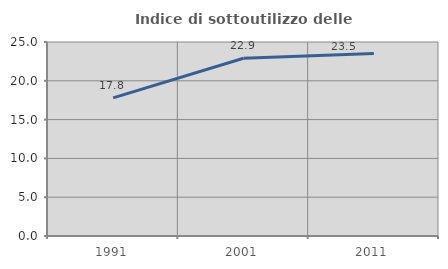
| Category | Indice di sottoutilizzo delle abitazioni  |
|---|---|
| 1991.0 | 17.798 |
| 2001.0 | 22.912 |
| 2011.0 | 23.524 |